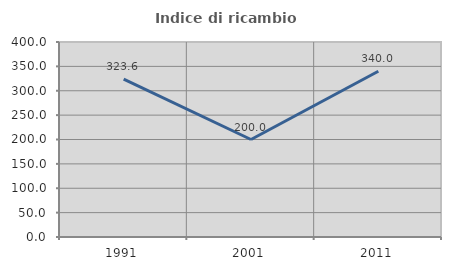
| Category | Indice di ricambio occupazionale  |
|---|---|
| 1991.0 | 323.636 |
| 2001.0 | 200 |
| 2011.0 | 340 |